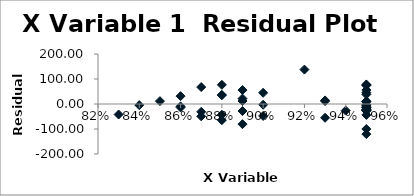
| Category | Series 0 |
|---|---|
| 0.84 | -4.684 |
| 0.88 | -64.694 |
| 0.89 | 21.679 |
| 0.83 | -42.057 |
| 0.93 | 11.669 |
| 0.95 | -7.886 |
| 0.95 | -13.886 |
| 0.95 | 8.514 |
| 0.95 | -22.786 |
| 0.93 | 14.369 |
| 0.86 | -9.539 |
| 0.95 | -120.386 |
| 0.89 | -28.121 |
| 0.9 | -47.649 |
| 0.89 | 11.979 |
| 0.95 | 10.714 |
| 0.95 | 74.314 |
| 0.88 | 76.706 |
| 0.87 | -49.367 |
| 0.95 | -15.086 |
| 0.95 | -3.086 |
| 0.95 | -21.986 |
| 0.9 | -2.949 |
| 0.95 | -26.286 |
| 0.85 | 11.488 |
| 0.87 | -31.167 |
| 0.88 | -42.694 |
| 0.94 | -26.258 |
| 0.88 | 35.606 |
| 0.95 | -27.186 |
| 0.95 | 11.214 |
| 0.95 | 75.514 |
| 0.95 | 45.614 |
| 0.95 | 55.714 |
| 0.89 | -80.621 |
| 0.89 | 55.779 |
| 0.92 | 137.697 |
| 0.93 | -55.031 |
| 0.95 | 78.214 |
| 0.95 | -4.586 |
| 0.9 | 44.851 |
| 0.95 | -8.286 |
| 0.86 | 31.461 |
| 0.88 | 35.906 |
| 0.95 | -25.786 |
| 0.95 | -99.986 |
| 0.95 | 38.414 |
| 0.95 | -43.686 |
| 0.87 | 67.733 |
| 0.95 | -15.686 |
| 0.86 | -13.739 |